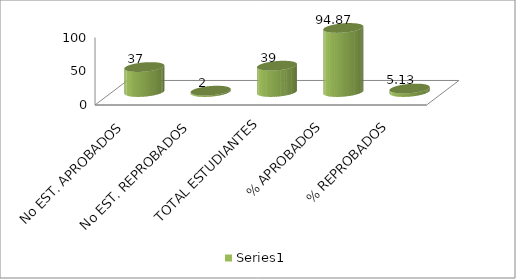
| Category | Series 0 |
|---|---|
| No EST. APROBADOS | 37 |
| No EST. REPROBADOS | 2 |
| TOTAL ESTUDIANTES | 39 |
| % APROBADOS | 94.872 |
| % REPROBADOS | 5.128 |